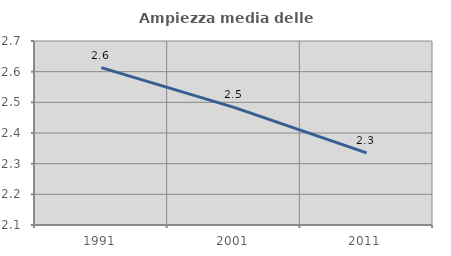
| Category | Ampiezza media delle famiglie |
|---|---|
| 1991.0 | 2.613 |
| 2001.0 | 2.483 |
| 2011.0 | 2.335 |